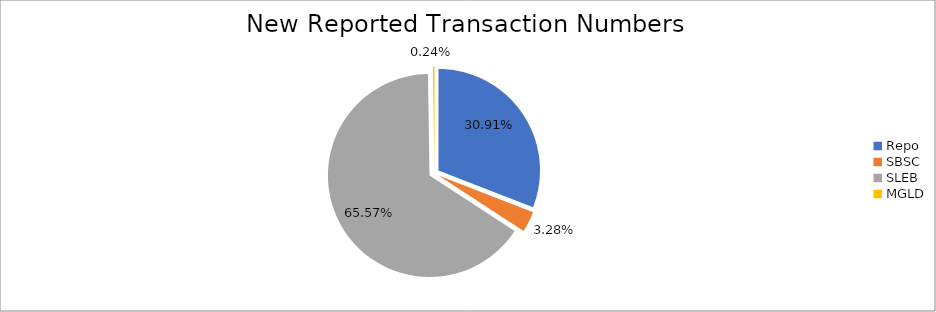
| Category | Series 0 |
|---|---|
| Repo | 415274 |
| SBSC | 44089 |
| SLEB | 881029 |
| MGLD | 3272 |